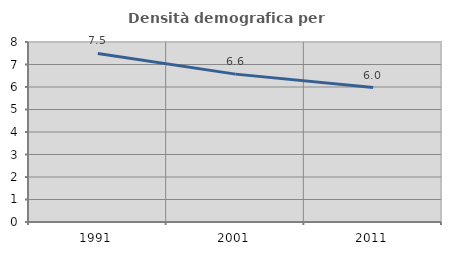
| Category | Densità demografica |
|---|---|
| 1991.0 | 7.489 |
| 2001.0 | 6.572 |
| 2011.0 | 5.975 |